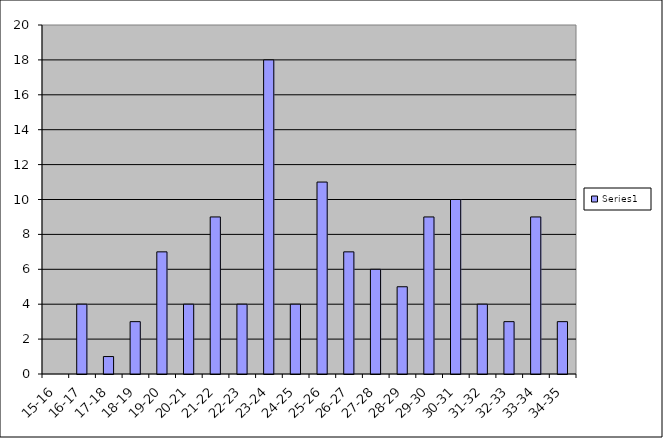
| Category | Series 0 |
|---|---|
| 15-16 | 0 |
| 16-17 | 4 |
| 17-18 | 1 |
| 18-19 | 3 |
| 19-20 | 7 |
| 20-21 | 4 |
| 21-22 | 9 |
| 22-23 | 4 |
| 23-24 | 18 |
| 24-25 | 4 |
| 25-26 | 11 |
| 26-27 | 7 |
| 27-28 | 6 |
| 28-29 | 5 |
| 29-30 | 9 |
| 30-31 | 10 |
| 31-32 | 4 |
| 32-33 | 3 |
| 33-34 | 9 |
| 34-35 | 3 |